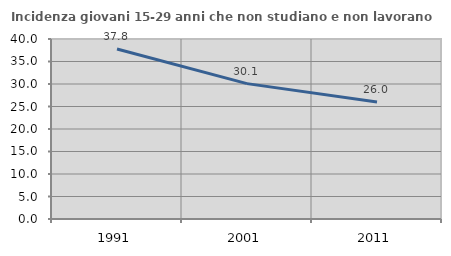
| Category | Incidenza giovani 15-29 anni che non studiano e non lavorano  |
|---|---|
| 1991.0 | 37.767 |
| 2001.0 | 30.085 |
| 2011.0 | 26.02 |